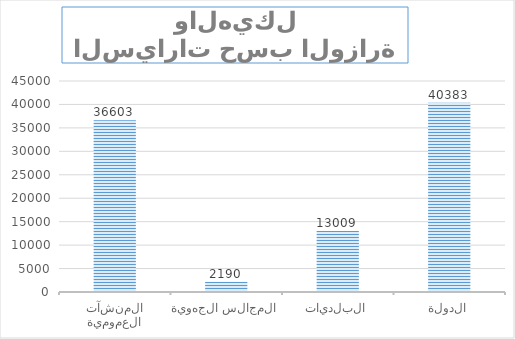
| Category | المنشآت العمومية |
|---|---|
| المنشآت العمومية | 36603 |
| المجالس الجهوية | 2190 |
| البلديات | 13009 |
| الدولة | 40383 |